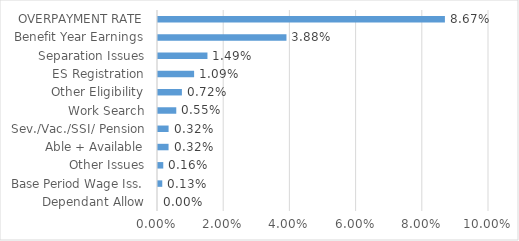
| Category | Series 0 |
|---|---|
| Dependant Allow | 0 |
| Base Period Wage Iss. | 0.001 |
| Other Issues | 0.002 |
| Able + Available | 0.003 |
| Sev./Vac./SSI/ Pension | 0.003 |
| Work Search | 0.006 |
| Other Eligibility | 0.007 |
| ES Registration | 0.011 |
| Separation Issues | 0.015 |
| Benefit Year Earnings | 0.039 |
| OVERPAYMENT RATE | 0.087 |